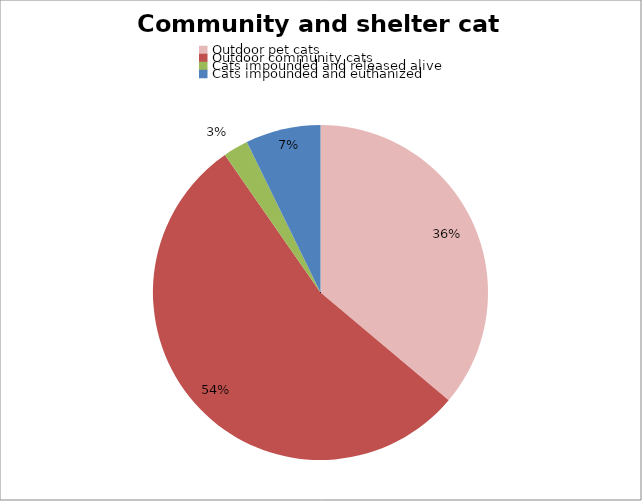
| Category | Series 0 |
|---|---|
| Outdoor pet cats | 29904761.905 |
| Outdoor community cats | 44857142.857 |
| Cats impounded and released alive | 2000000 |
| Cats impounded and euthanized | 6000000 |